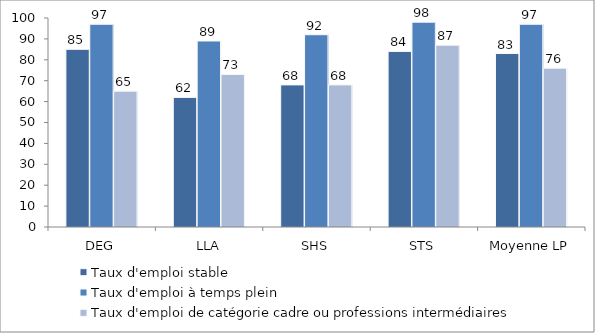
| Category | Taux d'emploi stable | Taux d'emploi à temps plein | Taux d'emploi de catégorie cadre ou professions intermédiaires |
|---|---|---|---|
| DEG | 85 | 97 | 65 |
| LLA | 62 | 89 | 73 |
| SHS | 68 | 92 | 68 |
| STS | 84 | 98 | 87 |
| Moyenne LP | 83 | 97 | 76 |